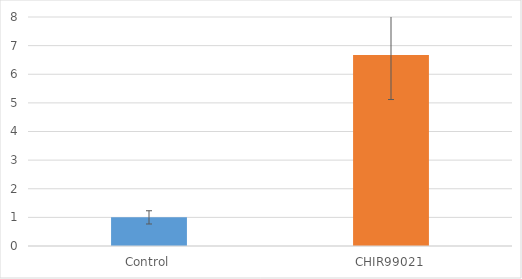
| Category | Average |
|---|---|
| Control | 1 |
| CHIR99021 | 6.668 |